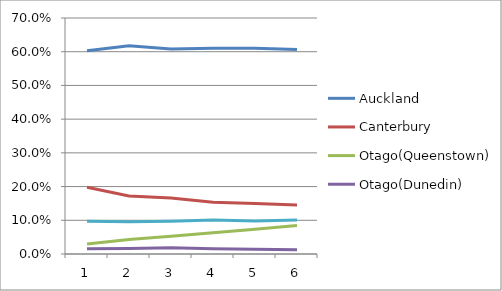
| Category | Auckland | Canterbury | Otago(Queenstown) | Otago(Dunedin) | Wellington |
|---|---|---|---|---|---|
| 0 | 0.603 | 0.198 | 0.03 | 0.015 | 0.097 |
| 1 | 0.618 | 0.172 | 0.043 | 0.016 | 0.096 |
| 2 | 0.608 | 0.166 | 0.052 | 0.018 | 0.097 |
| 3 | 0.61 | 0.153 | 0.063 | 0.016 | 0.101 |
| 4 | 0.611 | 0.15 | 0.074 | 0.014 | 0.098 |
| 5 | 0.607 | 0.145 | 0.085 | 0.012 | 0.101 |